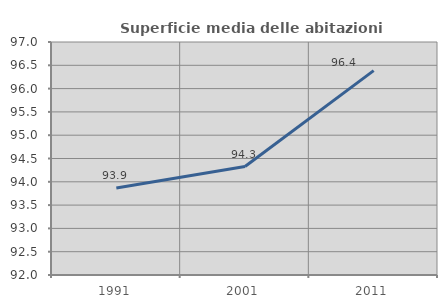
| Category | Superficie media delle abitazioni occupate |
|---|---|
| 1991.0 | 93.867 |
| 2001.0 | 94.327 |
| 2011.0 | 96.387 |